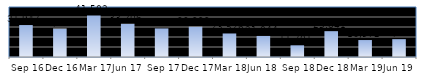
| Category | Series 0 |
|---|---|
| Sep 16 | 31947 |
| Dec 16 | 28460 |
| Mar 17 | 41502 |
| Jun 17 | 33206 |
| Sep 17 | 28578 |
| Dec 17 | 30292 |
| Mar 18 | 23526 |
| Jun 18 | 21044 |
| Sep 18 | 11701 |
| Dec 18 | 25841 |
| Mar 19 | 16972 |
| Jun 19 | 17846 |